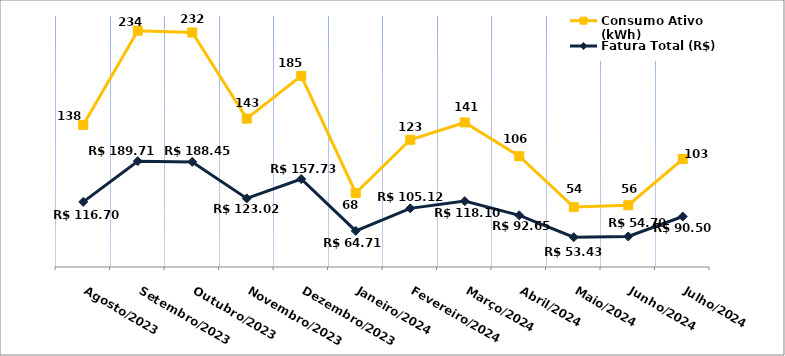
| Category | Fatura Total (R$) | Consumo Ativo (kWh) |
|---|---|---|
| Agosto/2023 | 116.7 | 138 |
| Setembro/2023 | 189.71 | 234 |
| Outubro/2023 | 188.45 | 232 |
| Novembro/2023 | 123.02 | 143 |
| Dezembro/2023 | 157.73 | 185 |
| Janeiro/2024 | 64.71 | 68 |
| Fevereiro/2024 | 105.12 | 123 |
| Março/2024 | 118.1 | 141 |
| Abril/2024 | 92.65 | 106 |
| Maio/2024 | 53.43 | 54 |
| Junho/2024 | 54.7 | 56 |
| Julho/2024 | 90.5 | 103 |